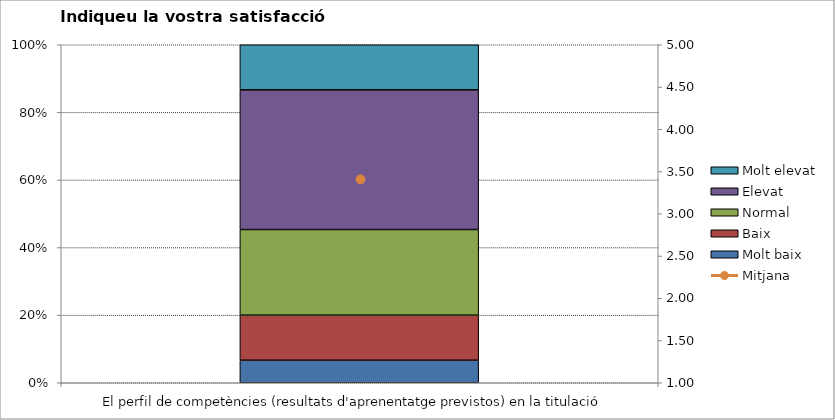
| Category | Molt baix | Baix | Normal  | Elevat | Molt elevat |
|---|---|---|---|---|---|
| El perfil de competències (resultats d'aprenentatge previstos) en la titulació | 5 | 10 | 19 | 31 | 10 |